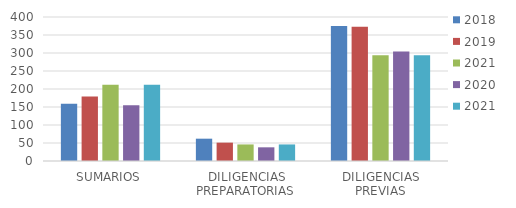
| Category | 2018 | 2019 | 2021 | 2020 |
|---|---|---|---|---|
| SUMARIOS | 159 | 179 | 212 | 155 |
| DILIGENCIAS PREPARATORIAS | 62 | 51 | 46 | 38 |
| DILIGENCIAS PREVIAS | 375 | 373 | 294 | 304 |